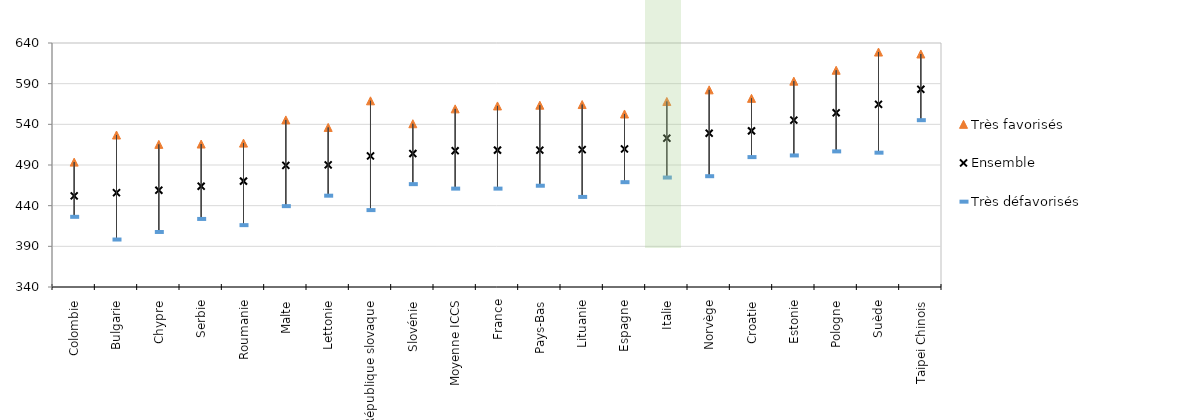
| Category | Très favorisés | Ensemble | Très défavorisés |
|---|---|---|---|
| Colombie | 493.551 | 452.071 | 426.277 |
| Bulgarie | 526.883 | 455.921 | 398.372 |
| Chypre | 515.368 | 458.961 | 407.66 |
| Serbie | 515.79 | 463.943 | 423.674 |
| Roumanie | 516.929 | 470.123 | 416.059 |
| Malte | 545.43 | 489.547 | 439.42 |
| Lettonie | 536.191 | 490.111 | 452.267 |
| République slovaque | 568.902 | 501.099 | 434.553 |
| Slovénie | 540.733 | 504.059 | 466.457 |
| Moyenne ICCS | 559.021 | 507.573 | 460.955 |
| France | 562.61 | 508.277 | 460.949 |
| Pays-Bas | 563.537 | 508.289 | 464.509 |
| Lituanie | 564.337 | 508.88 | 450.753 |
| Espagne | 552.72 | 509.701 | 468.887 |
| Italie | 568.12 | 522.986 | 474.571 |
| Norvège | 582.404 | 529.13 | 476.228 |
| Croatie | 571.969 | 532 | 499.714 |
| Estonie | 593.096 | 545.154 | 501.752 |
| Pologne | 606.491 | 554.219 | 506.748 |
| Suède | 628.879 | 564.613 | 505.142 |
| Taipei Chinois | 626.479 | 583.06 | 545.106 |